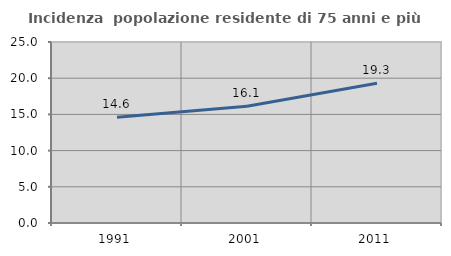
| Category | Incidenza  popolazione residente di 75 anni e più |
|---|---|
| 1991.0 | 14.593 |
| 2001.0 | 16.124 |
| 2011.0 | 19.29 |